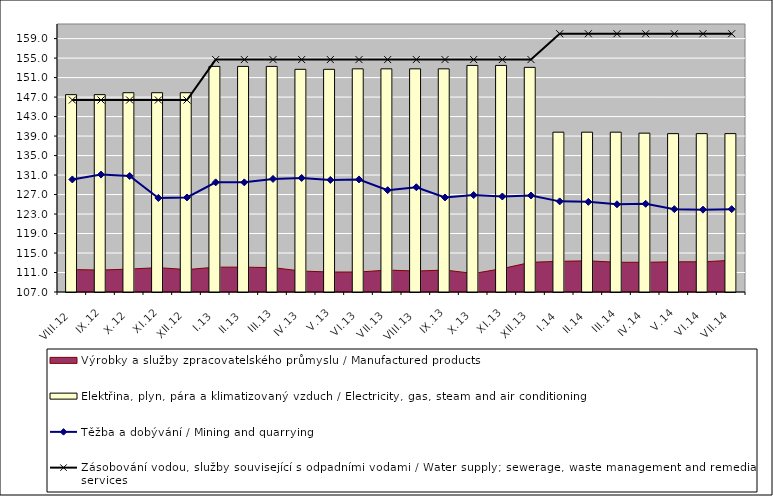
| Category | Elektřina, plyn, pára a klimatizovaný vzduch / Electricity, gas, steam and air conditioning |
|---|---|
| VIII.12 | 147.5 |
| IX.12 | 147.5 |
| X.12 | 147.9 |
| XI.12 | 147.9 |
| XII.12 | 147.9 |
| I.13 | 153.3 |
| II.13 | 153.3 |
| III.13 | 153.3 |
| IV.13 | 152.7 |
| V.13 | 152.7 |
| VI.13 | 152.8 |
| VII.13 | 152.8 |
| VIII.13 | 152.8 |
| IX.13 | 152.8 |
| X.13 | 153.5 |
| XI.13 | 153.5 |
| XII.13 | 153.1 |
| I.14 | 139.8 |
| II.14 | 139.8 |
| III.14 | 139.8 |
| IV.14 | 139.6 |
| V.14 | 139.5 |
| VI.14 | 139.5 |
| VII.14 | 139.5 |